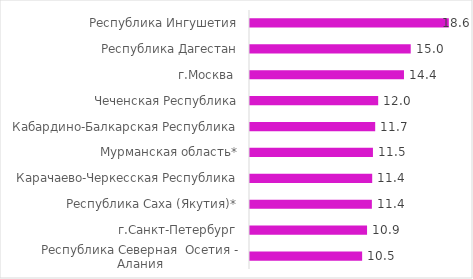
| Category | Проживут  мужчины после возраста 60 , лет  |
|---|---|
| Республика Северная  Осетия - Алания | 10.48 |
| г.Санкт-Петербург | 10.94 |
| Республика Саха (Якутия)* | 11.39 |
| Карачаево-Черкесская Республика | 11.42 |
| Мурманская область* | 11.49 |
| Кабардино-Балкарская Республика | 11.7 |
| Чеченская Республика | 11.98 |
| г.Москва  | 14.39 |
| Республика Дагестан | 15.02 |
| Республика Ингушетия | 18.58 |